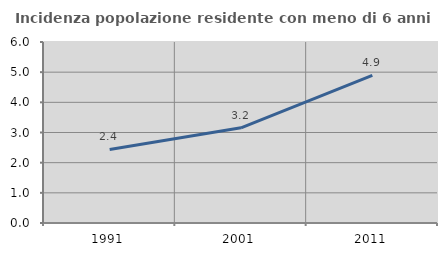
| Category | Incidenza popolazione residente con meno di 6 anni |
|---|---|
| 1991.0 | 2.439 |
| 2001.0 | 3.155 |
| 2011.0 | 4.89 |